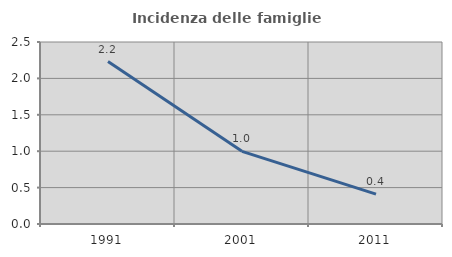
| Category | Incidenza delle famiglie numerose |
|---|---|
| 1991.0 | 2.23 |
| 2001.0 | 0.998 |
| 2011.0 | 0.411 |